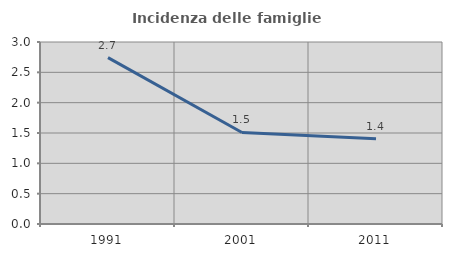
| Category | Incidenza delle famiglie numerose |
|---|---|
| 1991.0 | 2.743 |
| 2001.0 | 1.508 |
| 2011.0 | 1.406 |